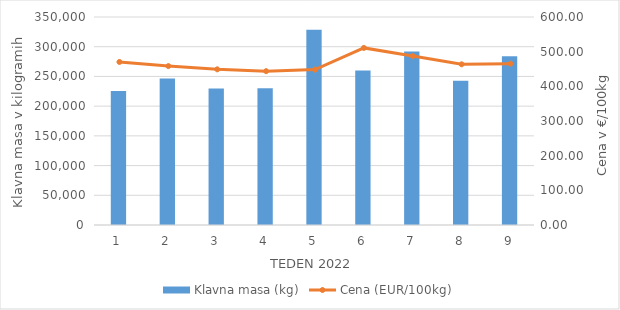
| Category | Klavna masa (kg) |
|---|---|
| 1.0 | 225300 |
| 2.0 | 246712 |
| 3.0 | 229541 |
| 4.0 | 230074 |
| 5.0 | 328640 |
| 6.0 | 260108 |
| 7.0 | 291887 |
| 8.0 | 242732 |
| 9.0 | 283987 |